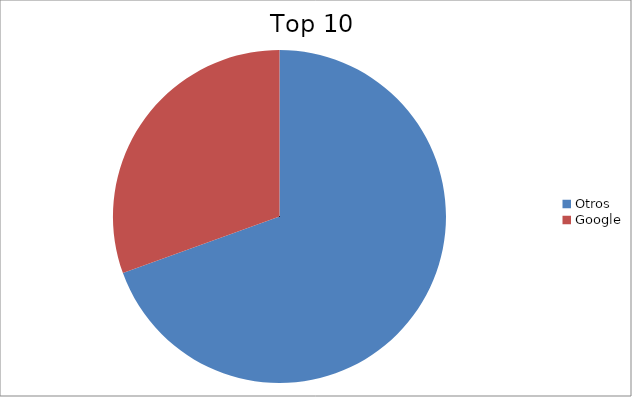
| Category | Series 0 |
|---|---|
| Otros | 69.48 |
| Google | 30.52 |